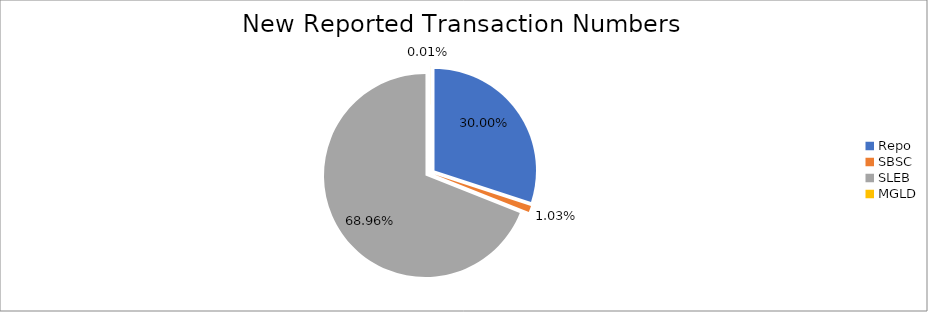
| Category | Series 0 |
|---|---|
| Repo | 297152 |
| SBSC | 10163 |
| SLEB | 682972 |
| MGLD | 63 |